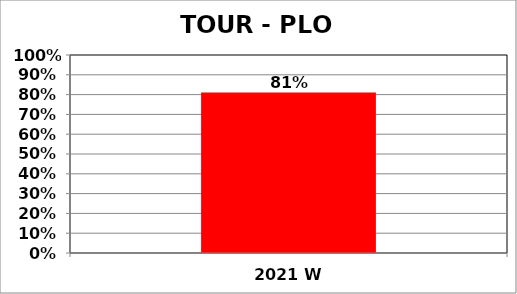
| Category | Series 0 |
|---|---|
| 2021 W | 0.81 |